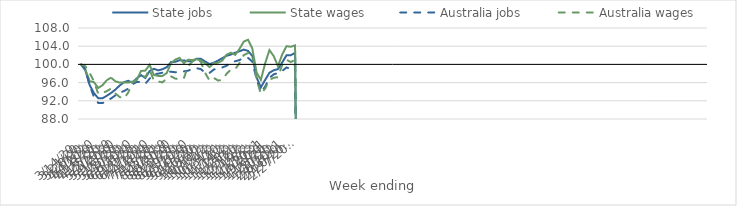
| Category | State jobs | State wages | Australia jobs | Australia wages |
|---|---|---|---|---|
| 14/03/2020 | 100 | 100 | 100 | 100 |
| 21/03/2020 | 98.65 | 98.839 | 98.956 | 99.591 |
| 28/03/2020 | 95.44 | 96.303 | 95.412 | 98.115 |
| 04/04/2020 | 93.676 | 96.096 | 92.813 | 96.238 |
| 11/04/2020 | 92.564 | 94.822 | 91.52 | 93.527 |
| 18/04/2020 | 92.551 | 95.433 | 91.497 | 93.722 |
| 25/04/2020 | 93.11 | 96.54 | 92.022 | 94.132 |
| 02/05/2020 | 93.725 | 97.086 | 92.516 | 94.683 |
| 09/05/2020 | 94.458 | 96.286 | 93.196 | 93.606 |
| 16/05/2020 | 95.352 | 95.998 | 93.786 | 92.839 |
| 23/05/2020 | 96.082 | 96.051 | 94.143 | 92.495 |
| 30/05/2020 | 96.395 | 96.007 | 94.652 | 93.805 |
| 06/06/2020 | 95.985 | 96.211 | 95.638 | 95.989 |
| 13/06/2020 | 96.937 | 96.591 | 96.141 | 96.647 |
| 20/06/2020 | 97.641 | 98.557 | 96.161 | 97.556 |
| 27/06/2020 | 97.016 | 98.63 | 95.749 | 97.243 |
| 04/07/2020 | 98.515 | 99.914 | 96.855 | 98.903 |
| 11/07/2020 | 99.041 | 97.679 | 97.864 | 96.396 |
| 18/07/2020 | 98.69 | 97.473 | 97.96 | 96.236 |
| 25/07/2020 | 98.933 | 97.473 | 98.177 | 96.05 |
| 01/08/2020 | 99.382 | 98.087 | 98.391 | 96.89 |
| 08/08/2020 | 100.507 | 100.253 | 98.384 | 97.377 |
| 15/08/2020 | 100.565 | 101.058 | 98.275 | 96.882 |
| 22/08/2020 | 100.902 | 101.426 | 98.328 | 96.723 |
| 29/08/2020 | 100.866 | 100.253 | 98.458 | 96.942 |
| 05/09/2020 | 100.699 | 101.037 | 98.618 | 99.637 |
| 12/09/2020 | 100.681 | 100.945 | 99.017 | 100.615 |
| 19/09/2020 | 101.262 | 101.144 | 99.166 | 101.346 |
| 26/09/2020 | 101.214 | 100.841 | 98.953 | 100.497 |
| 03/10/2020 | 100.633 | 100.215 | 98.095 | 98.1 |
| 10/10/2020 | 100.065 | 99.412 | 98.121 | 96.45 |
| 17/10/2020 | 100.362 | 100.27 | 98.87 | 97.028 |
| 24/10/2020 | 100.849 | 100.353 | 99.128 | 96.463 |
| 31/10/2020 | 101.376 | 100.853 | 99.332 | 96.583 |
| 07/11/2020 | 101.895 | 102.126 | 99.7 | 97.947 |
| 14/11/2020 | 102.163 | 102.584 | 100.404 | 98.872 |
| 21/11/2020 | 102.572 | 102.087 | 100.686 | 98.947 |
| 28/11/2020 | 102.884 | 103.396 | 100.954 | 100.289 |
| 05/12/2020 | 103.251 | 105.004 | 101.418 | 102.049 |
| 12/12/2020 | 102.971 | 105.421 | 101.44 | 102.491 |
| 19/12/2020 | 101.884 | 103.505 | 100.619 | 102.382 |
| 26/12/2020 | 97.14 | 98.247 | 96.814 | 96.897 |
| 02/01/2021 | 94.937 | 96.583 | 93.894 | 93.496 |
| 09/01/2021 | 96.582 | 100.216 | 95.102 | 94.672 |
| 16/01/2021 | 98.161 | 103.139 | 97.043 | 96.593 |
| 23/01/2021 | 98.708 | 101.843 | 97.81 | 97.069 |
| 30/01/2021 | 98.956 | 99.608 | 98.097 | 97.188 |
| 06/02/2021 | 100.427 | 102.215 | 98.579 | 99.942 |
| 13/02/2021 | 102.006 | 104.006 | 99.324 | 101.024 |
| 20/02/2021 | 102.027 | 103.88 | 98.998 | 100.508 |
| 27/02/2021 | 102.516 | 104.181 | 99.758 | 101.044 |